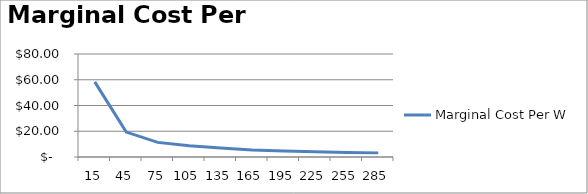
| Category | Marginal Cost Per W |
|---|---|
| 15.0 | 58.361 |
| 45.0 | 19.343 |
| 75.0 | 11.348 |
| 105.0 | 8.67 |
| 135.0 | 6.957 |
| 165.0 | 5.505 |
| 195.0 | 4.658 |
| 225.0 | 4.058 |
| 255.0 | 3.581 |
| 285.0 | 3.204 |